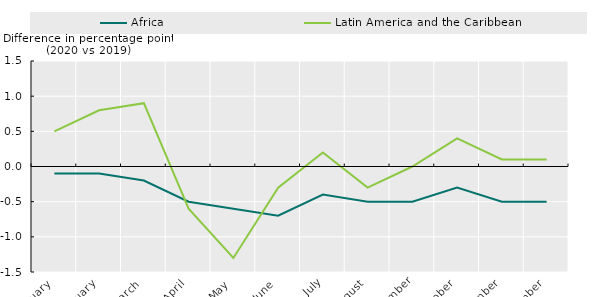
| Category | Africa | Latin America and the Caribbean |
|---|---|---|
| January | -0.1 | 0.5 |
| February | -0.1 | 0.8 |
| March | -0.2 | 0.9 |
| April | -0.5 | -0.6 |
| May | -0.6 | -1.3 |
| June | -0.7 | -0.3 |
| July | -0.4 | 0.2 |
| August | -0.5 | -0.3 |
| September | -0.5 | 0 |
| October | -0.3 | 0.4 |
| November | -0.5 | 0.1 |
| December | -0.5 | 0.1 |